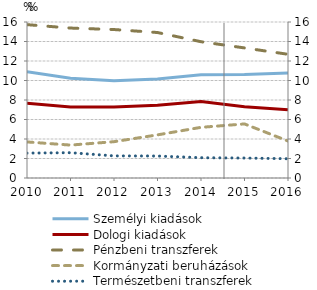
| Category | Személyi kiadások  | Dologi kiadások  | Pénzbeni transzferek | Kormányzati beruházások |
|---|---|---|---|---|
| 40179.0 | 10.896 | 7.654 | 15.728 | 3.699 |
| 40544.0 | 10.225 | 7.292 | 15.378 | 3.376 |
| 40909.0 | 9.981 | 7.286 | 15.226 | 3.724 |
| 41275.0 | 10.151 | 7.456 | 14.921 | 4.423 |
| 41640.0 | 10.583 | 7.857 | 13.979 | 5.196 |
| 42005.0 | 10.607 | 7.31 | 13.34 | 5.545 |
| 42370.0 | 10.758 | 6.997 | 12.688 | 3.793 |